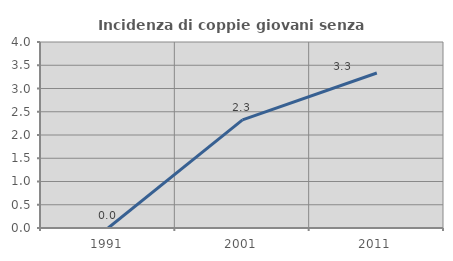
| Category | Incidenza di coppie giovani senza figli |
|---|---|
| 1991.0 | 0 |
| 2001.0 | 2.326 |
| 2011.0 | 3.333 |